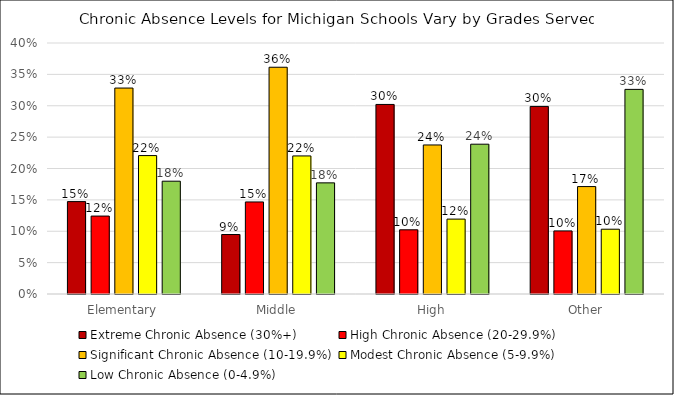
| Category | Extreme Chronic Absence (30%+) | High Chronic Absence (20-29.9%) | Significant Chronic Absence (10-19.9%) | Modest Chronic Absence (5-9.9%) | Low Chronic Absence (0-4.9%) |
|---|---|---|---|---|---|
| Elementary | 0.147 | 0.124 | 0.328 | 0.221 | 0.18 |
| Middle | 0.095 | 0.147 | 0.361 | 0.22 | 0.177 |
| High | 0.302 | 0.102 | 0.238 | 0.119 | 0.239 |
| Other | 0.299 | 0.101 | 0.171 | 0.103 | 0.326 |